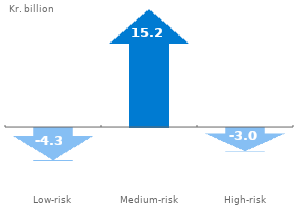
| Category | Serienavn |
|---|---|
| Low-risk | -4.25 |
| Medium-risk | 15.249 |
| High-risk | -3.025 |